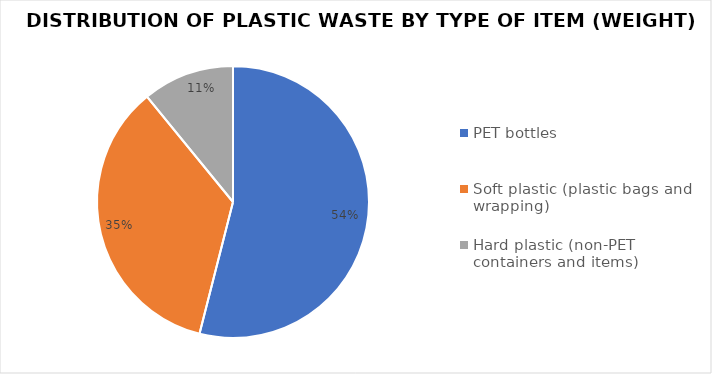
| Category | Series 0 |
|---|---|
| PET bottles | 266.96 |
| Soft plastic (plastic bags and wrapping) | 173.818 |
| Hard plastic (non-PET containers and items) | 53.94 |